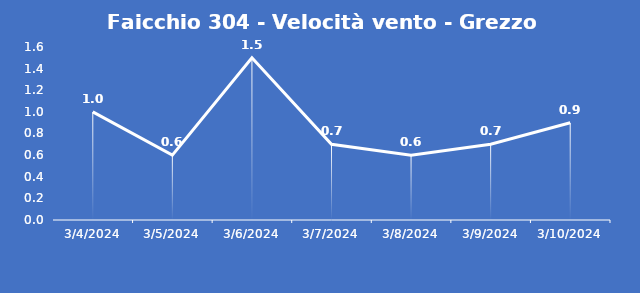
| Category | Faicchio 304 - Velocità vento - Grezzo (m/s) |
|---|---|
| 3/4/24 | 1 |
| 3/5/24 | 0.6 |
| 3/6/24 | 1.5 |
| 3/7/24 | 0.7 |
| 3/8/24 | 0.6 |
| 3/9/24 | 0.7 |
| 3/10/24 | 0.9 |